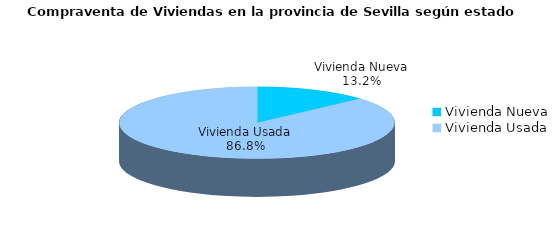
| Category | Series 0 | Series 1 |
|---|---|---|
| Vivienda Nueva | 181 | 0.132 |
| Vivienda Usada | 1187 | 0.868 |